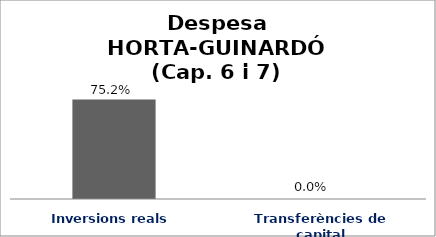
| Category | Series 0 |
|---|---|
| Inversions reals | 0.752 |
| Transferències de capital | 0 |